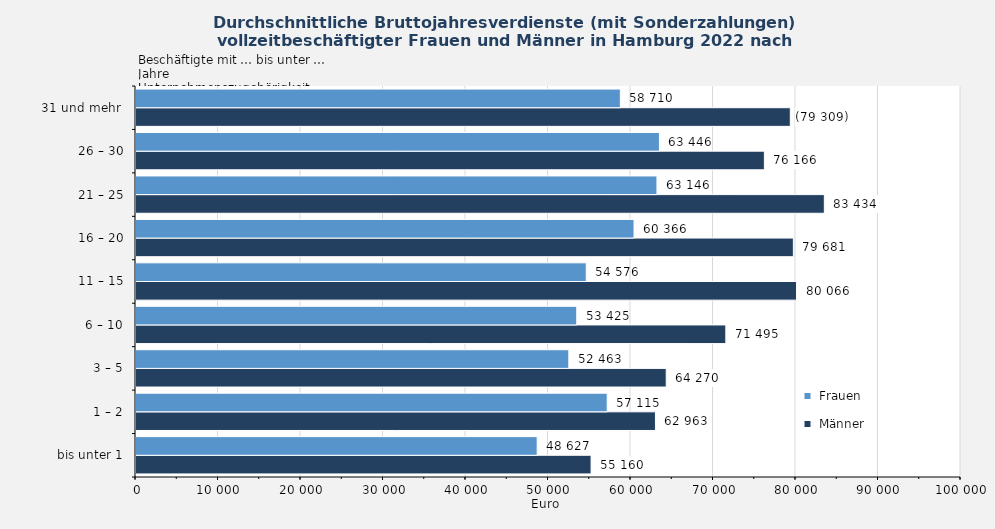
| Category |  Männer |  Frauen |
|---|---|---|
| bis unter 1 | 55160 | 48627 |
| 1 – 2 | 62963 | 57115 |
| 3 – 5 | 64270 | 52463 |
| 6 – 10 | 71495 | 53425 |
| 11 – 15 | 80066 | 54576 |
| 16 – 20 | 79681 | 60366 |
| 21 – 25 | 83434 | 63146 |
| 26 – 30 | 76166 | 63446 |
| 31 und mehr  | 79309 | 58710 |